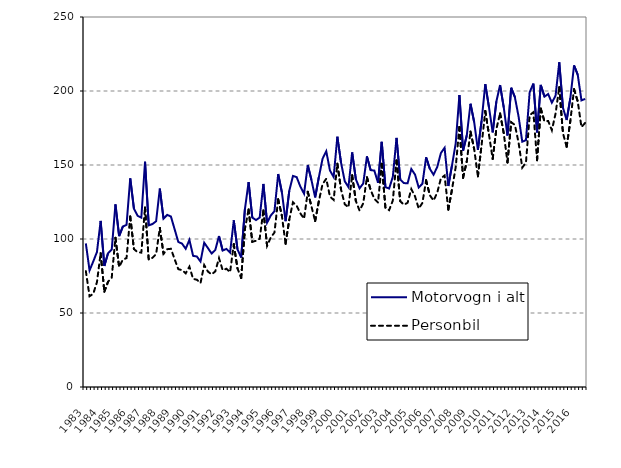
| Category | Motorvogn i alt | Personbil |
|---|---|---|
| 1983.0 | 97 | 78.3 |
| nan | 78.8 | 61.3 |
| nan | 84.8 | 63 |
| nan | 91.2 | 70.8 |
| 1984.0 | 112.2 | 90.4 |
| nan | 81.8 | 64.4 |
| nan | 90.4 | 71.1 |
| nan | 92.9 | 73.9 |
| 1985.0 | 123.4 | 100.8 |
| nan | 102 | 81.1 |
| nan | 108.4 | 86 |
| nan | 109.6 | 87.1 |
| 1986.0 | 141 | 115.2 |
| nan | 120.5 | 93.2 |
| nan | 115.7 | 91.1 |
| nan | 114.4 | 90.8 |
| 1987.0 | 152.2 | 121.3 |
| nan | 109.2 | 86.1 |
| nan | 110.1 | 87.3 |
| nan | 112 | 89.8 |
| 1988.0 | 134.1 | 107.5 |
| nan | 113.7 | 90 |
| nan | 116.3 | 93.1 |
| nan | 115.2 | 93.4 |
| 1989.0 | 106.6 | 86.4 |
| nan | 98 | 79.6 |
| nan | 96.9 | 79 |
| nan | 93.4 | 76.8 |
| 1990.0 | 99.4 | 81.3 |
| nan | 88.6 | 73.1 |
| nan | 88.2 | 72.5 |
| nan | 84.8 | 70.2 |
| 1991.0 | 97.5 | 82.4 |
| nan | 93.9 | 78 |
| nan | 90.2 | 76.1 |
| nan | 92.6 | 78.1 |
| 1992.0 | 102 | 87.1 |
| nan | 92.2 | 78.9 |
| nan | 93.3 | 79.9 |
| nan | 90.8 | 77.6 |
| 1993.0 | 112.6 | 96.5 |
| nan | 93 | 80.1 |
| nan | 87.5 | 73.6 |
| nan | 120.1 | 106.6 |
| 1994.0 | 138.4 | 120 |
| nan | 114.5 | 98.1 |
| nan | 112.8 | 98.8 |
| nan | 114.5 | 100.2 |
| 1995.0 | 137.2 | 119.3 |
| nan | 111 | 95.4 |
| nan | 115.9 | 101 |
| nan | 118.8 | 104.4 |
| 1996.0 | 143.9 | 126.9 |
| nan | 131.6 | 115.7 |
| nan | 112 | 96.7 |
| nan | 132.5 | 113.1 |
| 1997.0 | 142.6 | 124.8 |
| nan | 141.8 | 122.5 |
| nan | 135.4 | 117.3 |
| nan | 130.6 | 113.7 |
| 1998.0 | 150 | 131.9 |
| nan | 139.8 | 122 |
| nan | 128.1 | 112.1 |
| nan | 141.8 | 125.6 |
| 1999.0 | 154.2 | 137.1 |
| nan | 159.3 | 140.7 |
| nan | 146.3 | 128.7 |
| nan | 141.9 | 126.4 |
| 2000.0 | 169.1 | 150.9 |
| nan | 151.5 | 133.4 |
| nan | 139 | 123.5 |
| nan | 135.1 | 121.4 |
| 2001.0 | 158.5 | 143.1 |
| nan | 140.46 | 125.7 |
| nan | 134.24 | 119.2 |
| nan | 137.495 | 124.072 |
| 2002.0 | 155.814 | 141.724 |
| nan | 146.543 | 133.19 |
| nan | 146.231 | 127.141 |
| nan | 137.967 | 124.641 |
| 2003.0 | 165.679 | 150.811 |
| nan | 135.021 | 121.101 |
| nan | 134.111 | 119.491 |
| nan | 142.013 | 125.959 |
| 2004.0 | 168.309 | 153.043 |
| nan | 140.267 | 125.568 |
| nan | 137.77 | 123.121 |
| nan | 137.685 | 124.506 |
| 2005.0 | 147.311 | 133.756 |
| nan | 143.517 | 128.79 |
| nan | 134.783 | 120.571 |
| nan | 137.37 | 124.382 |
| 2006.0 | 155.213 | 139.728 |
| nan | 147.444 | 129.572 |
| nan | 143.451 | 126.006 |
| nan | 148.561 | 131.195 |
| 2007.0 | 158.1 | 141.084 |
| nan | 161.613 | 142.897 |
| nan | 135.821 | 119.753 |
| nan | 149.791 | 133.498 |
| 2008.0 | 164.642 | 148.614 |
| nan | 197.287 | 175.714 |
| nan | 159.718 | 141.407 |
| nan | 170.057 | 152.54 |
| 2009.0 | 191.38 | 172.559 |
| nan | 178.906 | 160.765 |
| nan | 160.234 | 142.312 |
| nan | 179.857 | 163.532 |
| 2010.0 | 204.636 | 186.507 |
| nan | 188.957 | 170.463 |
| nan | 172.077 | 154.156 |
| nan | 192.961 | 174.399 |
| 2011.0 | 204.005 | 184.86 |
| nan | 188.741 | 171.333 |
| nan | 169.934 | 151.694 |
| nan | 202.176 | 178.919 |
| 2012.0 | 195.829 | 177.072 |
| nan | 182.751 | 165.128 |
| nan | 165.73 | 148.242 |
| nan | 166.805 | 151.728 |
| 2013.0 | 199.181 | 183.653 |
| nan | 205.015 | 185.634 |
| nan | 172.044 | 153.21 |
| nan | 204.1 | 188.079 |
| 2014.0 | 196.177 | 179.552 |
| nan | 197.965 | 179.767 |
| nan | 192.105 | 173.474 |
| nan | 196.809 | 184.739 |
| 2015.0 | 219.419 | 202.592 |
| nan | 188.696 | 171.451 |
| nan | 180.388 | 162.297 |
| nan | 195.23 | 179.891 |
| 2016.0 | 217.298 | 201.197 |
| nan | 210.949 | 192.893 |
| nan | 193.648 | 175.642 |
| nan | 194.663 | 178.455 |